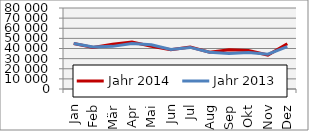
| Category | Jahr 2014 | Jahr 2013 |
|---|---|---|
| Jan | 44967.454 | 45026.856 |
| Feb | 40988.12 | 41503.972 |
| Mär | 44120.8 | 42110.324 |
| Apr | 46401.621 | 44869.033 |
| Mai | 42169.599 | 43709.448 |
| Jun | 38669.005 | 38936.821 |
| Jul | 41368.369 | 41088.529 |
| Aug | 36388.552 | 36298.485 |
| Sep | 38758.828 | 35117.047 |
| Okt | 38081.94 | 36018.692 |
| Nov | 33532.021 | 34312.09 |
| Dez | 44733.422 | 41893.703 |